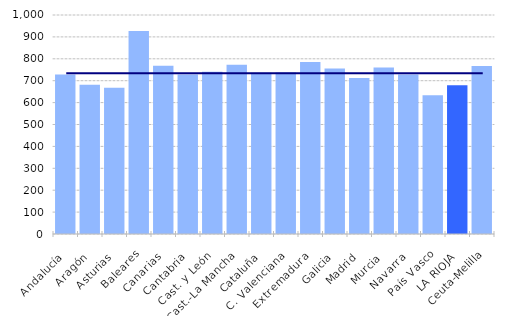
| Category | Series 1 |
|---|---|
| Andalucía | 727.86 |
| Aragón | 681.805 |
| Asturias | 668.131 |
| Baleares | 926.424 |
| Canarias | 767.912 |
| Cantabria | 728.27 |
| Cast. y León | 740.811 |
| Cast.-La Mancha | 772.625 |
| Cataluña | 735.828 |
| C. Valenciana | 737.242 |
| Extremadura | 785.293 |
| Galicia | 755.593 |
| Madrid | 712.69 |
| Murcia | 760.819 |
| Navarra | 728.549 |
| País Vasco | 633.115 |
| LA RIOJA | 679.655 |
| Ceuta-Melilla | 767.065 |